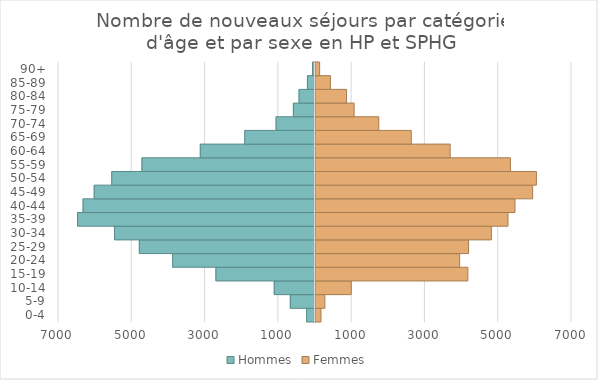
| Category | Hommes | Femmes |
|---|---|---|
| 0-4 | -228 | 150 |
| 5-9 | -674 | 255 |
| 10-14 | -1113 | 977 |
| 15-19 | -2704 | 4158 |
| 20-24 | -3884 | 3934 |
| 25-29 | -4794 | 4177 |
| 30-34 | -5472 | 4800 |
| 35-39 | -6481 | 5253 |
| 40-44 | -6330 | 5444 |
| 45-49 | -6026 | 5926 |
| 50-54 | -5546 | 6029 |
| 55-59 | -4723 | 5320 |
| 60-64 | -3130 | 3675 |
| 65-69 | -1916 | 2614 |
| 70-74 | -1062 | 1727 |
| 75-79 | -590 | 1054 |
| 80-84 | -436 | 847 |
| 85-89 | -206 | 408 |
| 90+ | -67 | 113 |